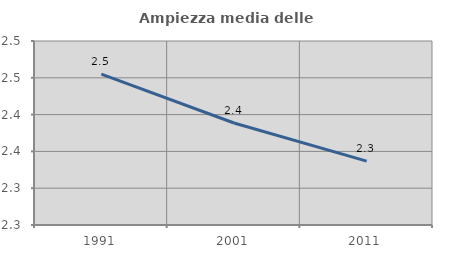
| Category | Ampiezza media delle famiglie |
|---|---|
| 1991.0 | 2.455 |
| 2001.0 | 2.389 |
| 2011.0 | 2.337 |